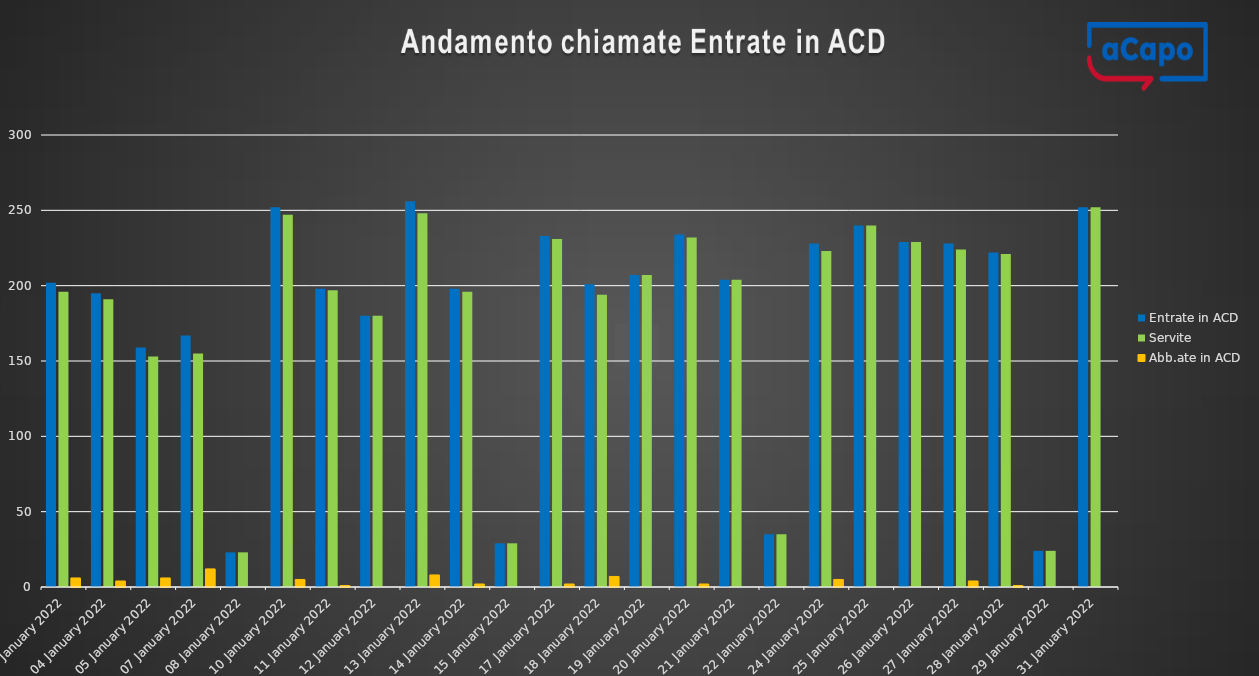
| Category | Entrate in ACD | Servite | Abb.ate in ACD |
|---|---|---|---|
| 2022-01-03 | 202 | 196 | 6 |
| 2022-01-04 | 195 | 191 | 4 |
| 2022-01-05 | 159 | 153 | 6 |
| 2022-01-07 | 167 | 155 | 12 |
| 2022-01-08 | 23 | 23 | 0 |
| 2022-01-10 | 252 | 247 | 5 |
| 2022-01-11 | 198 | 197 | 1 |
| 2022-01-12 | 180 | 180 | 0 |
| 2022-01-13 | 256 | 248 | 8 |
| 2022-01-14 | 198 | 196 | 2 |
| 2022-01-15 | 29 | 29 | 0 |
| 2022-01-17 | 233 | 231 | 2 |
| 2022-01-18 | 201 | 194 | 7 |
| 2022-01-19 | 207 | 207 | 0 |
| 2022-01-20 | 234 | 232 | 2 |
| 2022-01-21 | 204 | 204 | 0 |
| 2022-01-22 | 35 | 35 | 0 |
| 2022-01-24 | 228 | 223 | 5 |
| 2022-01-25 | 240 | 240 | 0 |
| 2022-01-26 | 229 | 229 | 0 |
| 2022-01-27 | 228 | 224 | 4 |
| 2022-01-28 | 222 | 221 | 1 |
| 2022-01-29 | 24 | 24 | 0 |
| 2022-01-31 | 252 | 252 | 0 |